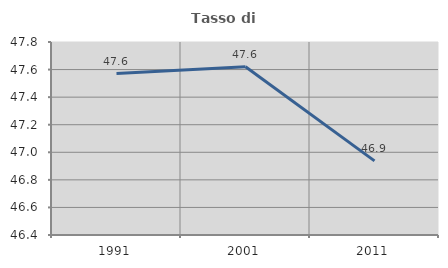
| Category | Tasso di occupazione   |
|---|---|
| 1991.0 | 47.571 |
| 2001.0 | 47.62 |
| 2011.0 | 46.938 |